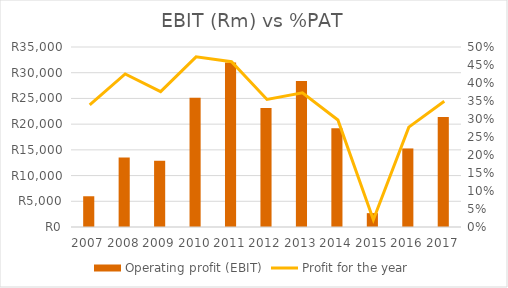
| Category | Operating profit (EBIT) |
|---|---|
| 2007.0 | 5978 |
| 2008.0 | 13513 |
| 2009.0 | 12880 |
| 2010.0 | 25131 |
| 2011.0 | 31966 |
| 2012.0 | 23153 |
| 2013.0 | 28385 |
| 2014.0 | 19192 |
| 2015.0 | 2696 |
| 2016.0 | 15274 |
| 2017.0 | 21390 |